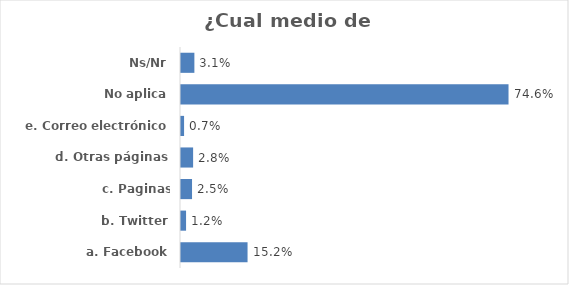
| Category | Series 0 |
|---|---|
| a. Facebook | 0.152 |
| b. Twitter | 0.012 |
| c. Paginas institucionales | 0.025 |
| d. Otras páginas | 0.028 |
| e. Correo electrónico | 0.007 |
| No aplica | 0.746 |
| Ns/Nr | 0.031 |